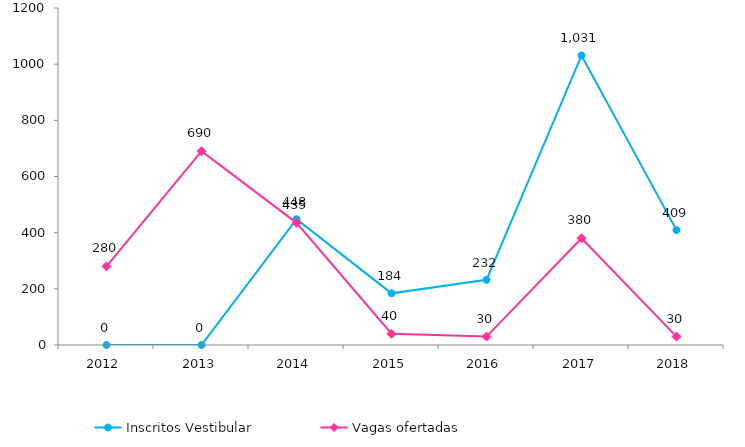
| Category | Inscritos Vestibular |
|---|---|
| 2012.0 | 0 |
| 2013.0 | 0 |
| 2014.0 | 448 |
| 2015.0 | 184 |
| 2016.0 | 232 |
| 2017.0 | 1031 |
| 2018.0 | 409 |